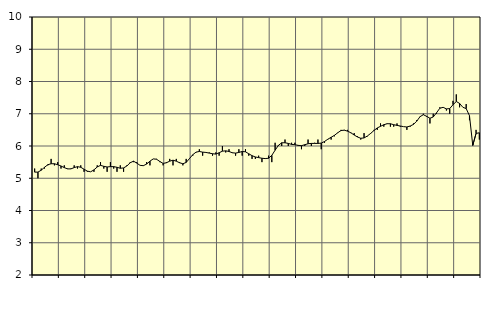
| Category | Piggar | Personliga och kulturella tjänster, SNI 90-98 |
|---|---|---|
| nan | 5.3 | 5.19 |
| 87.0 | 5 | 5.19 |
| 87.0 | 5.3 | 5.25 |
| 87.0 | 5.3 | 5.34 |
| nan | 5.4 | 5.42 |
| 88.0 | 5.6 | 5.45 |
| 88.0 | 5.4 | 5.45 |
| 88.0 | 5.5 | 5.42 |
| nan | 5.3 | 5.38 |
| 89.0 | 5.4 | 5.33 |
| 89.0 | 5.3 | 5.29 |
| 89.0 | 5.3 | 5.29 |
| nan | 5.4 | 5.33 |
| 90.0 | 5.3 | 5.36 |
| 90.0 | 5.4 | 5.34 |
| 90.0 | 5.2 | 5.28 |
| nan | 5.2 | 5.22 |
| 91.0 | 5.2 | 5.2 |
| 91.0 | 5.2 | 5.26 |
| 91.0 | 5.4 | 5.35 |
| nan | 5.5 | 5.4 |
| 92.0 | 5.3 | 5.37 |
| 92.0 | 5.2 | 5.35 |
| 92.0 | 5.5 | 5.36 |
| nan | 5.3 | 5.36 |
| 93.0 | 5.2 | 5.34 |
| 93.0 | 5.4 | 5.31 |
| 93.0 | 5.2 | 5.32 |
| nan | 5.4 | 5.38 |
| 94.0 | 5.5 | 5.48 |
| 94.0 | 5.5 | 5.53 |
| 94.0 | 5.5 | 5.47 |
| nan | 5.4 | 5.4 |
| 95.0 | 5.4 | 5.39 |
| 95.0 | 5.5 | 5.44 |
| 95.0 | 5.4 | 5.53 |
| nan | 5.6 | 5.6 |
| 96.0 | 5.6 | 5.59 |
| 96.0 | 5.5 | 5.52 |
| 96.0 | 5.4 | 5.46 |
| nan | 5.5 | 5.48 |
| 97.0 | 5.6 | 5.53 |
| 97.0 | 5.4 | 5.56 |
| 97.0 | 5.6 | 5.53 |
| nan | 5.5 | 5.48 |
| 98.0 | 5.4 | 5.45 |
| 98.0 | 5.6 | 5.49 |
| 98.0 | 5.6 | 5.61 |
| nan | 5.7 | 5.73 |
| 99.0 | 5.8 | 5.81 |
| 99.0 | 5.9 | 5.83 |
| 99.0 | 5.7 | 5.81 |
| nan | 5.8 | 5.8 |
| 0.0 | 5.8 | 5.78 |
| 0.0 | 5.7 | 5.76 |
| 0.0 | 5.8 | 5.75 |
| nan | 5.7 | 5.79 |
| 1.0 | 6 | 5.84 |
| 1.0 | 5.8 | 5.85 |
| 1.0 | 5.9 | 5.83 |
| nan | 5.8 | 5.79 |
| 2.0 | 5.7 | 5.78 |
| 2.0 | 5.9 | 5.8 |
| 2.0 | 5.7 | 5.83 |
| nan | 5.9 | 5.82 |
| 3.0 | 5.7 | 5.76 |
| 3.0 | 5.6 | 5.7 |
| 3.0 | 5.6 | 5.66 |
| nan | 5.7 | 5.64 |
| 4.0 | 5.5 | 5.62 |
| 4.0 | 5.6 | 5.61 |
| 4.0 | 5.7 | 5.62 |
| nan | 5.5 | 5.71 |
| 5.0 | 6.1 | 5.87 |
| 5.0 | 6 | 6.02 |
| 5.0 | 6 | 6.1 |
| nan | 6.2 | 6.1 |
| 6.0 | 6 | 6.08 |
| 6.0 | 6.1 | 6.05 |
| 6.0 | 6.1 | 6.04 |
| nan | 6 | 6.02 |
| 7.0 | 5.9 | 6.01 |
| 7.0 | 6 | 6.04 |
| 7.0 | 6.2 | 6.07 |
| nan | 6 | 6.08 |
| 8.0 | 6.1 | 6.08 |
| 8.0 | 6.2 | 6.08 |
| 8.0 | 5.9 | 6.09 |
| nan | 6.1 | 6.14 |
| 9.0 | 6.2 | 6.21 |
| 9.0 | 6.2 | 6.27 |
| 9.0 | 6.3 | 6.33 |
| nan | 6.4 | 6.41 |
| 10.0 | 6.5 | 6.48 |
| 10.0 | 6.5 | 6.49 |
| 10.0 | 6.5 | 6.46 |
| nan | 6.4 | 6.41 |
| 11.0 | 6.4 | 6.34 |
| 11.0 | 6.3 | 6.28 |
| 11.0 | 6.2 | 6.24 |
| nan | 6.4 | 6.25 |
| 12.0 | 6.3 | 6.31 |
| 12.0 | 6.4 | 6.39 |
| 12.0 | 6.5 | 6.48 |
| nan | 6.5 | 6.56 |
| 13.0 | 6.7 | 6.61 |
| 13.0 | 6.6 | 6.66 |
| 13.0 | 6.7 | 6.69 |
| nan | 6.6 | 6.69 |
| 14.0 | 6.6 | 6.66 |
| 14.0 | 6.7 | 6.64 |
| 14.0 | 6.6 | 6.62 |
| nan | 6.6 | 6.6 |
| 15.0 | 6.5 | 6.59 |
| 15.0 | 6.6 | 6.62 |
| 15.0 | 6.7 | 6.67 |
| nan | 6.8 | 6.77 |
| 16.0 | 6.9 | 6.91 |
| 16.0 | 7 | 6.97 |
| 16.0 | 6.9 | 6.92 |
| nan | 6.7 | 6.86 |
| 17.0 | 7 | 6.9 |
| 17.0 | 7 | 7.03 |
| 17.0 | 7.2 | 7.17 |
| nan | 7.2 | 7.2 |
| 18.0 | 7.1 | 7.15 |
| 18.0 | 7 | 7.16 |
| 18.0 | 7.4 | 7.28 |
| nan | 7.6 | 7.38 |
| 19.0 | 7.2 | 7.32 |
| 19.0 | 7.2 | 7.2 |
| 19.0 | 7.3 | 7.16 |
| nan | 6.8 | 6.94 |
| 20.0 | 6.1 | 6.02 |
| 20.0 | 6.5 | 6.39 |
| 20.0 | 6.2 | 6.41 |